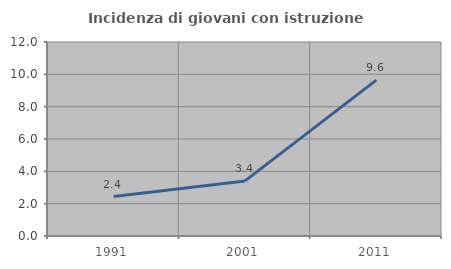
| Category | Incidenza di giovani con istruzione universitaria |
|---|---|
| 1991.0 | 2.439 |
| 2001.0 | 3.409 |
| 2011.0 | 9.639 |